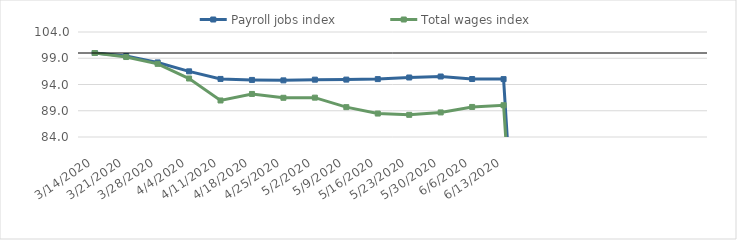
| Category | Payroll jobs index | Total wages index |
|---|---|---|
| 14/03/2020 | 100 | 100 |
| 21/03/2020 | 99.412 | 99.232 |
| 28/03/2020 | 98.203 | 97.932 |
| 04/04/2020 | 96.506 | 95.137 |
| 11/04/2020 | 95.061 | 90.957 |
| 18/04/2020 | 94.872 | 92.201 |
| 25/04/2020 | 94.788 | 91.47 |
| 02/05/2020 | 94.921 | 91.495 |
| 09/05/2020 | 94.935 | 89.686 |
| 16/05/2020 | 95.029 | 88.466 |
| 23/05/2020 | 95.336 | 88.223 |
| 30/05/2020 | 95.522 | 88.679 |
| 06/06/2020 | 95.042 | 89.724 |
| 13/06/2020 | 95.028 | 90.053 |